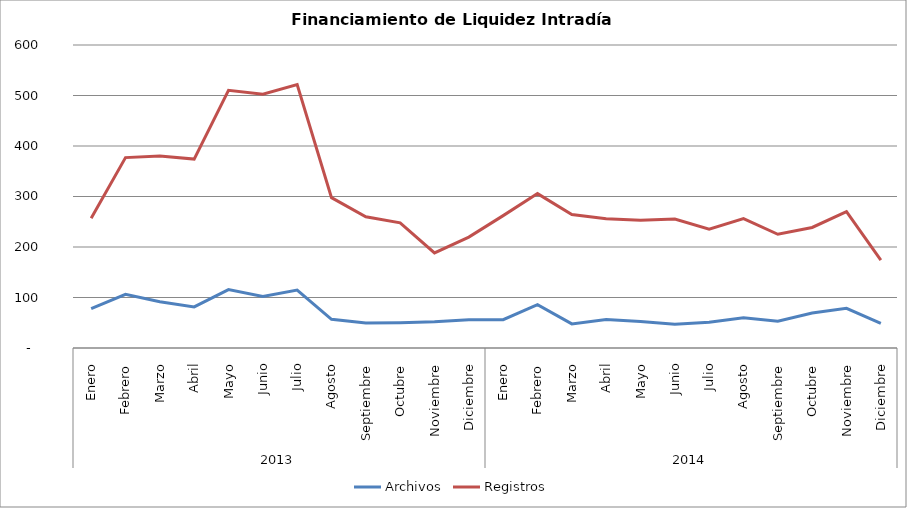
| Category | Archivos | Registros |
|---|---|---|
| 0 | 77.818 | 257.091 |
| 1 | 106.2 | 377 |
| 2 | 91.45 | 380.2 |
| 3 | 81.455 | 374.091 |
| 4 | 115.714 | 510.286 |
| 5 | 101.9 | 502.55 |
| 6 | 114.591 | 521.636 |
| 7 | 56.762 | 297.667 |
| 8 | 49.278 | 260 |
| 9 | 50 | 247.864 |
| 10 | 51.95 | 188.4 |
| 11 | 55.75 | 219.6 |
| 12 | 56 | 262.091 |
| 13 | 85.7 | 305.75 |
| 14 | 47.762 | 264.476 |
| 15 | 56.333 | 256.048 |
| 16 | 52.45 | 253.15 |
| 17 | 46.952 | 255.238 |
| 18 | 51.091 | 235.409 |
| 19 | 60 | 256.1 |
| 20 | 52.95 | 225.2 |
| 21 | 69.182 | 238.682 |
| 22 | 78.5 | 269.95 |
| 23 | 48.85 | 174.2 |